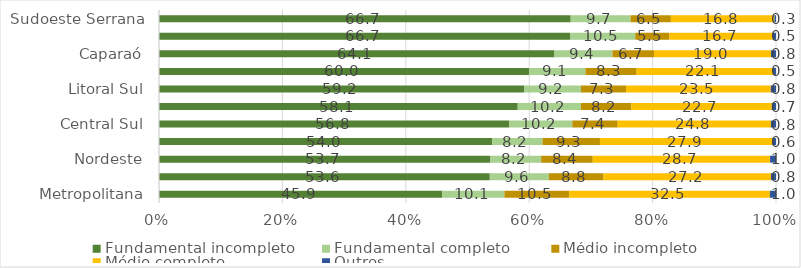
| Category | Fundamental incompleto | Fundamental completo | Médio incompleto | Médio completo | Outros |
|---|---|---|---|---|---|
| Metropolitana | 45.895 | 10.09 | 10.506 | 32.524 | 0.985 |
| Espírito Santo | 53.61 | 9.575 | 8.846 | 27.151 | 0.819 |
| Nordeste | 53.729 | 8.215 | 8.355 | 28.741 | 0.96 |
| Rio Doce | 53.998 | 8.167 | 9.302 | 27.93 | 0.603 |
| Central Sul | 56.792 | 10.197 | 7.358 | 24.826 | 0.827 |
| Centro-Oeste | 58.144 | 10.24 | 8.187 | 22.746 | 0.683 |
| Litoral Sul | 59.214 | 9.184 | 7.303 | 23.455 | 0.844 |
| Noroeste | 59.965 | 9.146 | 8.308 | 22.102 | 0.478 |
| Caparaó | 64.107 | 9.39 | 6.73 | 18.963 | 0.81 |
| Central Serrana | 66.686 | 10.503 | 5.547 | 16.743 | 0.522 |
| Sudoeste Serrana | 66.727 | 9.712 | 6.527 | 16.777 | 0.257 |